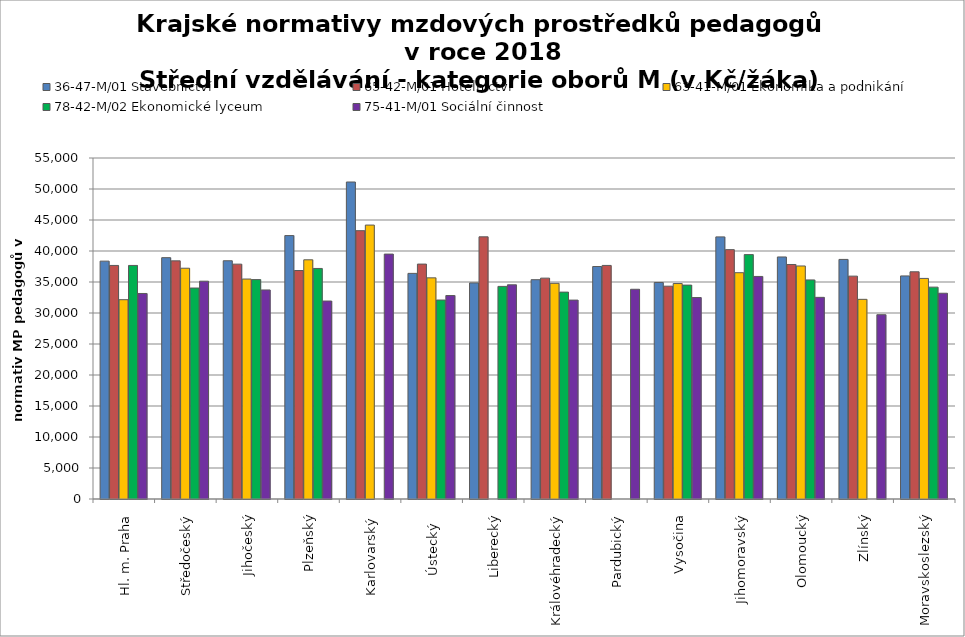
| Category | 36-47-M/01 Stavebnictví | 65-42-M/01 Hotelnictví | 63-41-M/01 Ekonomika a podnikání | 78-42-M/02 Ekonomické lyceum | 75-41-M/01 Sociální činnost |
|---|---|---|---|---|---|
| Hl. m. Praha | 38366.667 | 37669.091 | 32145.849 | 37669.091 | 33148.8 |
| Středočeský | 38924.027 | 38410.472 | 37222.309 | 34027.683 | 35130.367 |
| Jihočeský | 38425.316 | 37878.306 | 35478.261 | 35385.95 | 33719.008 |
| Plzeňský | 42485.95 | 36851.613 | 38580.113 | 37184.81 | 31930.435 |
| Karlovarský  | 51129.032 | 43276.451 | 44181.185 | 0 | 39501.558 |
| Ústecký   | 36391.128 | 37889.157 | 35668.809 | 32089.796 | 32815.304 |
| Liberecký | 34852.308 | 42285.794 | 0 | 34291.342 | 34546.695 |
| Královéhradecký | 35370.822 | 35622.796 | 34786.435 | 33368.687 | 32080.513 |
| Pardubický | 37495.472 | 37673.175 | 0 | 0 | 33825.702 |
| Vysočina | 34924.572 | 34325.275 | 34751.22 | 34500.255 | 32493.238 |
| Jihomoravský | 42275.958 | 40220.186 | 36501.569 | 39415.782 | 35896.516 |
| Olomoucký | 39039.698 | 37824.176 | 37583.258 | 35332.763 | 32522.835 |
| Zlínský | 38643.6 | 35947.535 | 32203 | 0 | 29725.846 |
| Moravskoslezský | 35979.185 | 36646.643 | 35578.045 | 34171.334 | 33187.2 |